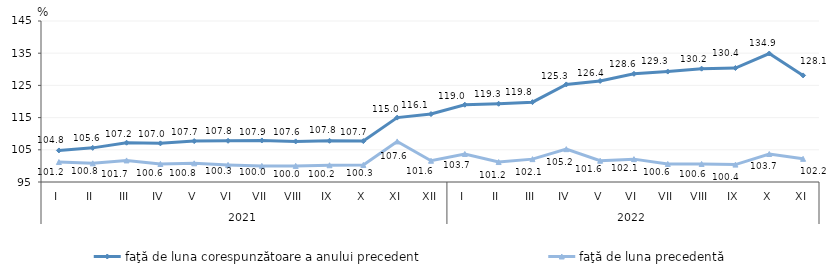
| Category | faţă de luna corespunzătoare a anului precedent | faţă de luna precedentă   |
|---|---|---|
| 0 | 104.8 | 101.2 |
| 1 | 105.6 | 100.8 |
| 2 | 107.2 | 101.7 |
| 3 | 107 | 100.6 |
| 4 | 107.7 | 100.8 |
| 5 | 107.8 | 100.3 |
| 6 | 107.9 | 100 |
| 7 | 107.6 | 100 |
| 8 | 107.8 | 100.2 |
| 9 | 107.7 | 100.3 |
| 10 | 115 | 107.6 |
| 11 | 116.1 | 101.6 |
| 12 | 119 | 103.7 |
| 13 | 119.3 | 101.2 |
| 14 | 119.8 | 102.1 |
| 15 | 125.3 | 105.2 |
| 16 | 126.4 | 101.6 |
| 17 | 128.6 | 102.1 |
| 18 | 129.3 | 100.6 |
| 19 | 130.2 | 100.6 |
| 20 | 130.4 | 100.4 |
| 21 | 134.9 | 103.7 |
| 22 | 128.1 | 102.2 |